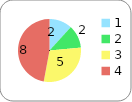
| Category | Series 0 |
|---|---|
| 0 | 2 |
| 1 | 2 |
| 2 | 5 |
| 3 | 8 |